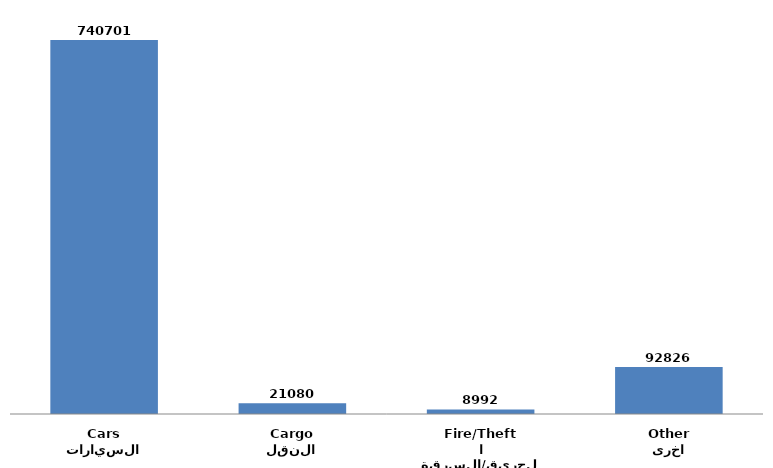
| Category | Series 0 |
|---|---|
| السيارات
Cars | 740701 |
| النقل
Cargo | 21080 |
| الحريق/السرقة
Fire/Theft | 8992 |
| اخرى
Other | 92826 |